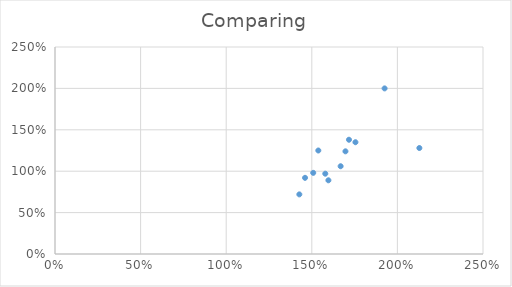
| Category | Series 0 |
|---|---|
| 2.1283321270126985 | 1.28 |
| 1.5787888873128857 | 0.97 |
| 1.5380201115447987 | 1.25 |
| 1.6965835998187488 | 1.24 |
| 1.5969918616260246 | 0.89 |
| 1.5082934143350568 | 0.98 |
| 1.4272014352015165 | 0.72 |
| 1.9252345184593977 | 2 |
| 1.7170879902673901 | 1.38 |
| 1.7549131282477137 | 1.35 |
| 1.460477122291371 | 0.92 |
| 1.668401449303587 | 1.06 |